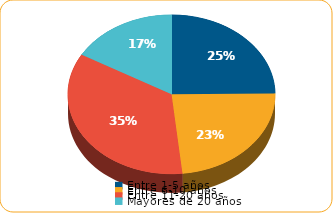
| Category | Series 0 |
|---|---|
| Entre 1-5 años | 3227.1 |
| Entre 6-10 años | 3051.8 |
| Entre 11-20 años | 4544.9 |
| Mayores de 20 años | 2171.1 |